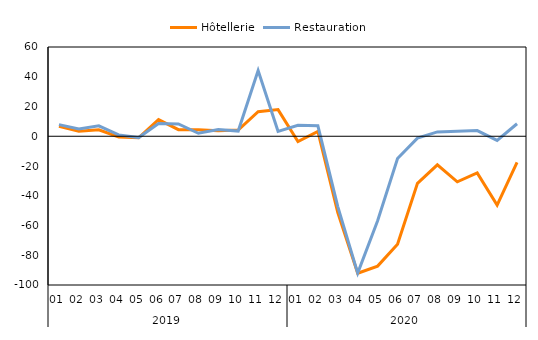
| Category | Hôtellerie | Restauration |
|---|---|---|
| 0 | 6.7 | 7.8 |
| 1 | 3.4 | 4.9 |
| 2 | 4.3 | 7 |
| 3 | -0.5 | 0.9 |
| 4 | -1 | -0.9 |
| 5 | 11.2 | 8.5 |
| 6 | 4.4 | 8.3 |
| 7 | 4.4 | 2 |
| 8 | 3.7 | 4.6 |
| 9 | 4.2 | 3.5 |
| 10 | 16.5 | 44.1 |
| 11 | 17.9 | 3.3 |
| 12 | -3.6 | 7.4 |
| 13 | 3.2 | 7 |
| 14 | -51.4 | -47.3 |
| 15 | -92.1 | -92 |
| 16 | -87.3 | -56.8 |
| 17 | -72.6 | -15 |
| 18 | -31.7 | -1.3 |
| 19 | -19.2 | 2.9 |
| 20 | -30.6 | 3.4 |
| 21 | -24.7 | 3.8 |
| 22 | -46.3 | -2.8 |
| 23 | -17.6 | 8.4 |